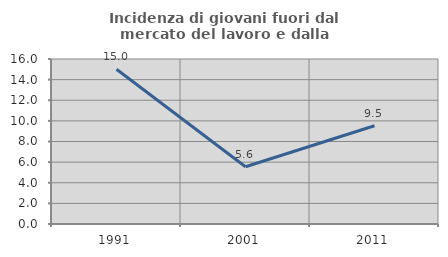
| Category | Incidenza di giovani fuori dal mercato del lavoro e dalla formazione  |
|---|---|
| 1991.0 | 15 |
| 2001.0 | 5.556 |
| 2011.0 | 9.524 |